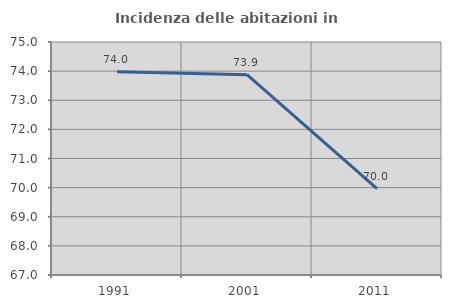
| Category | Incidenza delle abitazioni in proprietà  |
|---|---|
| 1991.0 | 73.978 |
| 2001.0 | 73.877 |
| 2011.0 | 69.964 |